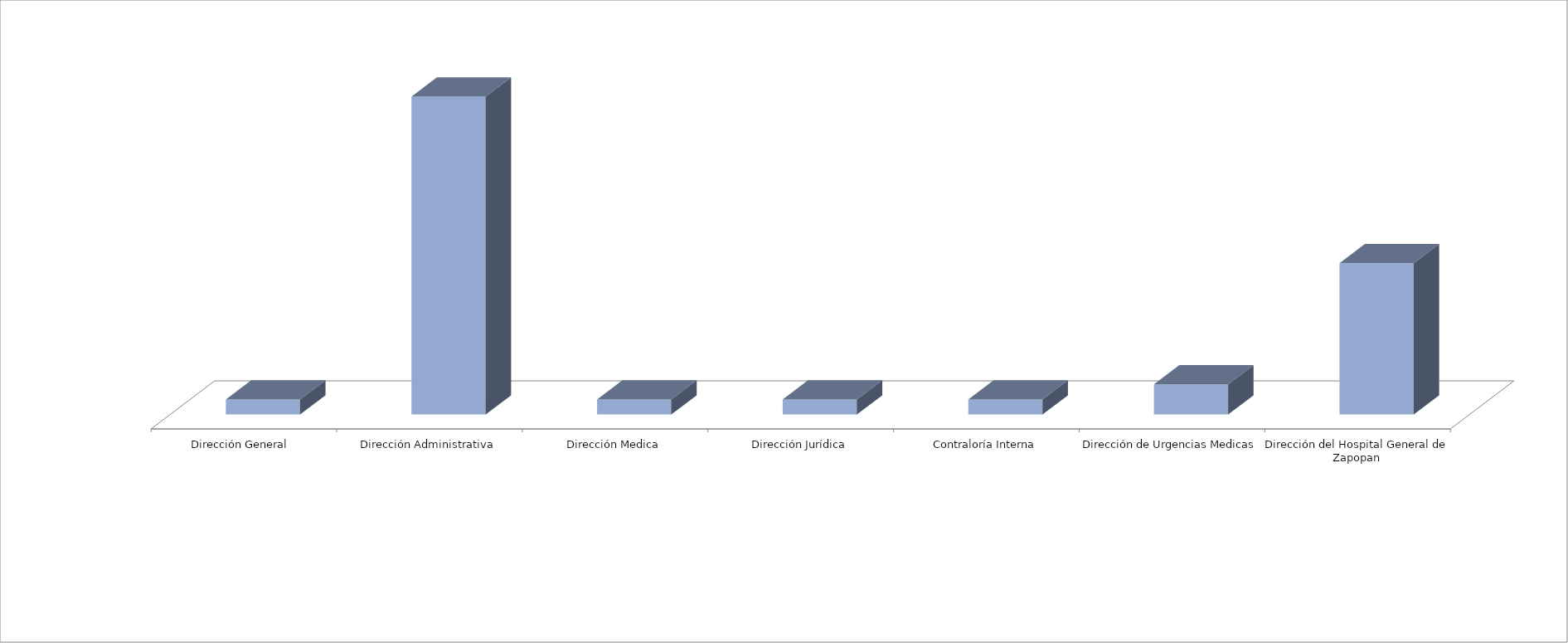
| Category | Series 0 | Series 1 |
|---|---|---|
| Dirección General  |  | 1 |
| Dirección Administrativa |  | 21 |
| Dirección Medica |  | 1 |
| Dirección Jurídica |  | 1 |
| Contraloría Interna |  | 1 |
| Dirección de Urgencias Medicas |  | 2 |
| Dirección del Hospital General de Zapopan |  | 10 |